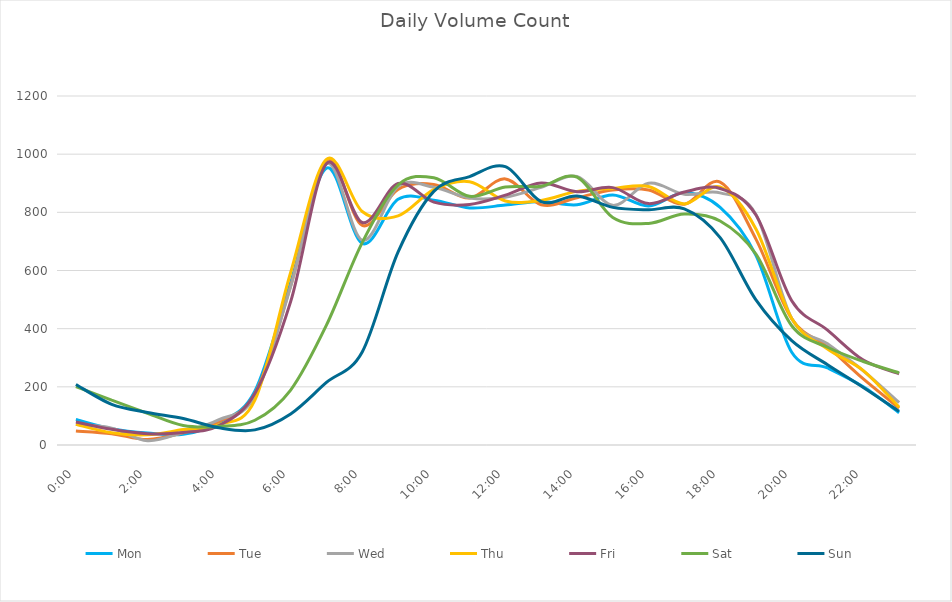
| Category | Mon | Tue | Wed | Thu | Fri | Sat | Sun |
|---|---|---|---|---|---|---|---|
| 0.0 | 88 | 48 | 71 | 71 | 79 | 201 | 208 |
| 0.0416666666666667 | 56 | 39 | 58 | 42 | 54 | 154 | 140 |
| 0.0833333333333333 | 41 | 19 | 15 | 35 | 39 | 109 | 112 |
| 0.125 | 37 | 42 | 44 | 53 | 43 | 67 | 91 |
| 0.166666666666667 | 77 | 81 | 87 | 70 | 67 | 64 | 59 |
| 0.208333333333333 | 185 | 176 | 168 | 154 | 177 | 85 | 52 |
| 0.25 | 558 | 547 | 545 | 593 | 493 | 189 | 107 |
| 0.291666666666667 | 952 | 979 | 967 | 982 | 967 | 412 | 215 |
| 0.333333333333333 | 693 | 755 | 704 | 803 | 765 | 696 | 320 |
| 0.375 | 845 | 879 | 889 | 788 | 899 | 894 | 663 |
| 0.416666666666667 | 842 | 896 | 886 | 878 | 835 | 919 | 872 |
| 0.4583333333333333 | 815 | 849 | 849 | 905 | 827 | 855 | 923 |
| 0.5 | 825 | 915 | 852 | 839 | 859 | 887 | 957 |
| 0.541666666666667 | 837 | 826 | 886 | 841 | 901 | 890 | 837 |
| 0.5833333333333334 | 826 | 850 | 923 | 872 | 871 | 921 | 856 |
| 0.625 | 860 | 877 | 824 | 882 | 885 | 782 | 817 |
| 0.666666666666667 | 822 | 877 | 900 | 889 | 830 | 762 | 809 |
| 0.7083333333333334 | 867 | 828 | 862 | 829 | 870 | 794 | 812 |
| 0.75 | 817 | 904 | 867 | 887 | 882 | 770 | 713 |
| 0.791666666666667 | 652 | 708 | 793 | 743 | 791 | 656 | 499 |
| 0.8333333333333334 | 319 | 434 | 435 | 435 | 496 | 410 | 359 |
| 0.875 | 265 | 338 | 348 | 330 | 395 | 336 | 276 |
| 0.916666666666667 | 200 | 227 | 255 | 256 | 292 | 287 | 198 |
| 0.9583333333333334 | 111 | 127 | 146 | 130 | 245 | 248 | 116 |